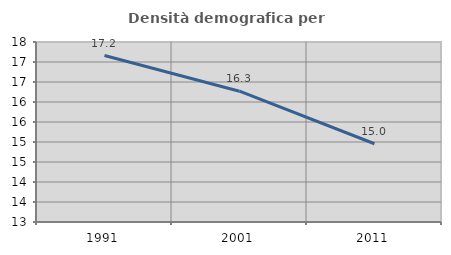
| Category | Densità demografica |
|---|---|
| 1991.0 | 17.162 |
| 2001.0 | 16.27 |
| 2011.0 | 14.956 |